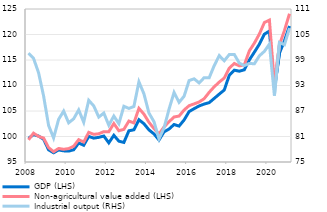
| Category | GDP (LHS) | Non-agricultural value added (LHS) |
|---|---|---|
| 2008 | 99.637 | 99.347 |
| II | 100.363 | 100.653 |
| III | 100.09 | 100.02 |
| IV | 99.463 | 99.693 |
| 2009 | 97.39 | 97.82 |
| II | 96.81 | 97.017 |
| III | 97.364 | 97.657 |
| IV | 97.185 | 97.494 |
| 2010 | 97.141 | 97.629 |
| II | 97.393 | 98.081 |
| III | 98.725 | 99.386 |
| IV | 98.282 | 98.908 |
| 2011 | 100.008 | 100.814 |
| II | 99.679 | 100.421 |
| III | 99.834 | 100.537 |
| IV | 100.094 | 100.949 |
| 2012 | 98.756 | 100.943 |
| II | 100.237 | 102.542 |
| III | 99.086 | 101.133 |
| IV | 98.834 | 101.399 |
| 2013 | 101.117 | 103.027 |
| II | 101.317 | 102.659 |
| III | 103.295 | 105.518 |
| IV | 102.503 | 104.383 |
| 2014 | 101.299 | 102.779 |
| II | 100.5 | 101.573 |
| III | 99.315 | 100.481 |
| IV | 100.909 | 101.869 |
| 2015 | 101.462 | 102.896 |
| II | 102.35 | 103.826 |
| III | 102.041 | 104.008 |
| IV | 103.242 | 105.19 |
| 2016 | 104.89 | 106.043 |
| II | 105.459 | 106.394 |
| III | 105.992 | 106.773 |
| IV | 106.361 | 107.414 |
| 2017 | 106.639 | 108.665 |
| II | 107.466 | 109.749 |
| III | 108.304 | 110.663 |
| IV | 109.117 | 111.465 |
| 2018 | 111.986 | 113.4 |
| II | 113.006 | 114.32 |
| III | 112.805 | 113.851 |
| IV | 113.077 | 114.044 |
| 2019 | 115.016 | 116.792 |
| II | 116.535 | 118.302 |
| III | 118.097 | 120.099 |
| IV | 120.063 | 122.351 |
| 2020 | 120.675 | 122.82 |
| II | 109.422 | 110.178 |
| III | 116.35 | 117.985 |
| IV | 118.776 | 120.807 |
| 2021 | 121.687 | 124.078 |